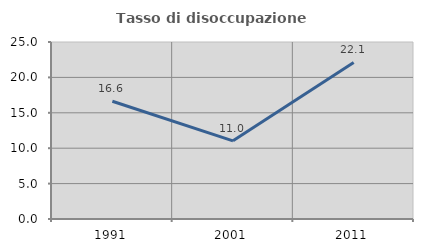
| Category | Tasso di disoccupazione giovanile  |
|---|---|
| 1991.0 | 16.637 |
| 2001.0 | 11.039 |
| 2011.0 | 22.105 |